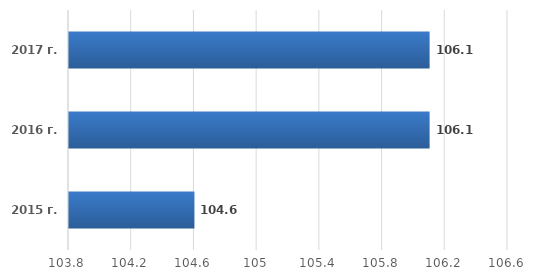
| Category | Series 0 |
|---|---|
| 2015 г. | 104.6 |
| 2016 г. | 106.1 |
| 2017 г. | 106.1 |